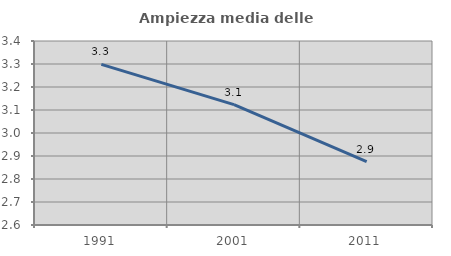
| Category | Ampiezza media delle famiglie |
|---|---|
| 1991.0 | 3.298 |
| 2001.0 | 3.124 |
| 2011.0 | 2.875 |